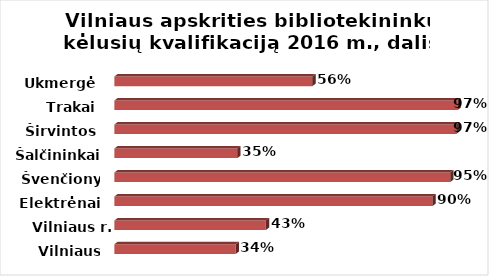
| Category | Series 0 |
|---|---|
| Vilniaus m. | 0.343 |
| Vilniaus r. | 0.429 |
| Elektrėnai | 0.9 |
| Švenčionys | 0.95 |
| Šalčininkai | 0.348 |
| Širvintos | 0.967 |
| Trakai | 0.971 |
| Ukmergė | 0.56 |